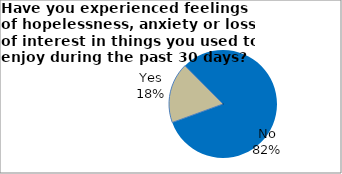
| Category | Series 0 |
|---|---|
| Yes | 18.109 |
| No | 81.891 |